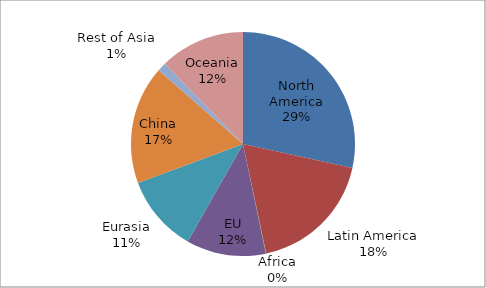
| Category | Series 0 |
|---|---|
| North America | 9.552 |
| Latin America | 6.124 |
| Africa | 0.016 |
| EU | 3.858 |
| Eurasia | 3.738 |
| China | 5.737 |
| Rest of Asia | 0.426 |
| Oceania | 4.131 |